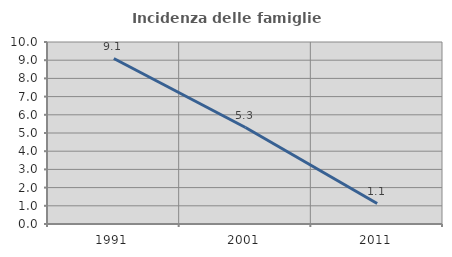
| Category | Incidenza delle famiglie numerose |
|---|---|
| 1991.0 | 9.091 |
| 2001.0 | 5.3 |
| 2011.0 | 1.125 |